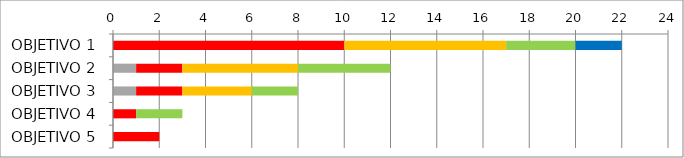
| Category | Series 1 | Series 2 | Series 3 | Series 4 | Series 5 |
|---|---|---|---|---|---|
| OBJETIVO 1 | 0 | 10 | 7 | 3 | 2 |
| OBJETIVO 2 | 1 | 2 | 5 | 4 | 0 |
| OBJETIVO 3 | 1 | 2 | 3 | 2 | 0 |
| OBJETIVO 4 | 0 | 1 | 0 | 2 | 0 |
| OBJETIVO 5 | 0 | 2 | 0 | 0 | 0 |